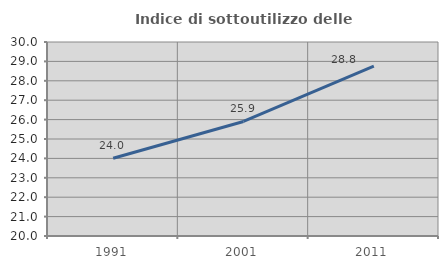
| Category | Indice di sottoutilizzo delle abitazioni  |
|---|---|
| 1991.0 | 24.01 |
| 2001.0 | 25.903 |
| 2011.0 | 28.759 |